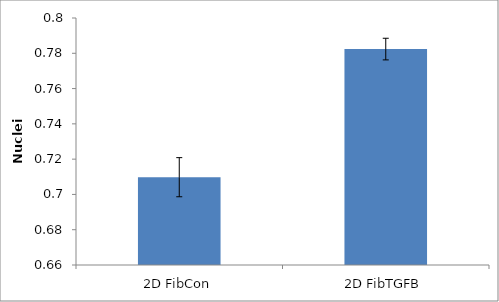
| Category | Series 0 |
|---|---|
| 2D FibCon | 0.71 |
| 2D FibTGFB | 0.782 |